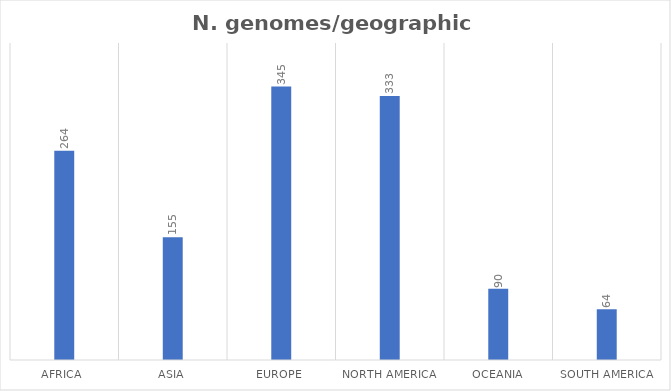
| Category | Series 0 |
|---|---|
| Africa  | 264 |
| Asia | 155 |
| Europe  | 345 |
| North America | 333 |
| Oceania | 90 |
| South America | 64 |